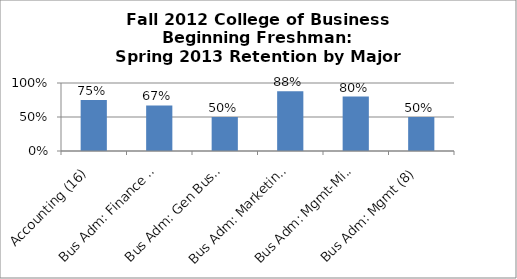
| Category | Series 0 |
|---|---|
| Accounting (16) | 0.75 |
| Bus Adm: Finance (6) | 0.67 |
| Bus Adm: Gen Business (24) | 0.5 |
| Bus Adm: Marketing (8) | 0.88 |
| Bus Adm: Mgmt-Mis (5) | 0.8 |
| Bus Adm: Mgmt (8) | 0.5 |